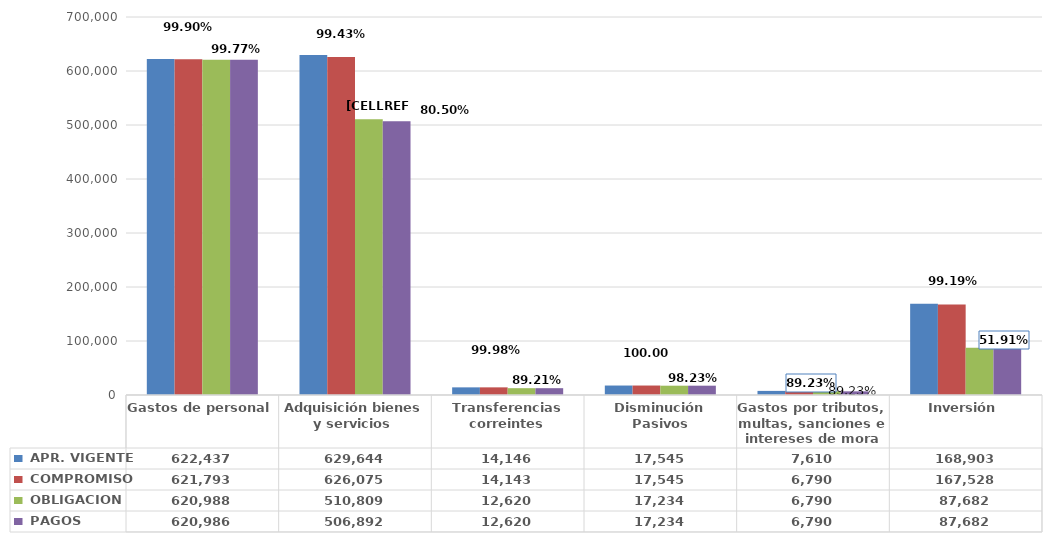
| Category |  APR. VIGENTE |  COMPROMISO |  OBLIGACION |  PAGOS |
|---|---|---|---|---|
| Gastos de personal | 622437364655 | 621793232893.47 | 620988493877.662 | 620985736633.662 |
| Adquisición bienes y servicios  | 629644342370 | 626075388967.15 | 510808871983.018 | 506892273839.888 |
| Transferencias correintes | 14146097894 | 14143300848.5 | 12620220571 | 12620220571 |
| Disminución Pasivos | 17545000000 | 17544999802.94 | 17233778558.94 | 17233778558.94 |
| Gastos por tributos, multas, sanciones e intereses de mora | 7610001478 | 6790341608.12 | 6790341608.12 | 6790341608.12 |
| Inversión | 168902570755 | 167528039006.75 | 87681895225.2 | 87681895225.2 |